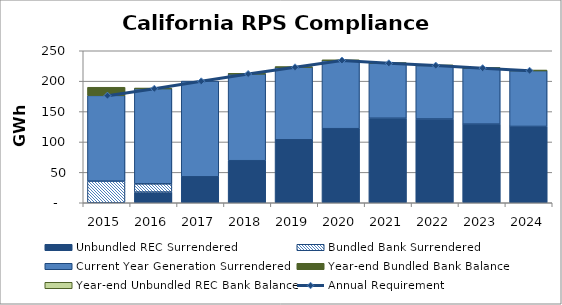
| Category | Unbundled REC Surrendered | Bundled Bank Surrendered | Current Year Generation Surrendered | Compliance Shortfall | Year-end Bundled Bank Balance | Year-end Unbundled REC Bank Balance |
|---|---|---|---|---|---|---|
| 2015.0 | 0 | 35.532 | 141.004 | 0 | 13.471 | 0 |
| 2016.0 | 17.626 | 13.471 | 156.865 | 0 | 0 | 0 |
| 2017.0 | 42.674 | 0 | 157.462 | 0 | 0 | 0 |
| 2018.0 | 69.148 | 0 | 142.978 | 0 | 0 | 0 |
| 2019.0 | 103.55 | 0 | 119.625 | 0 | 0 | 0 |
| 2020.0 | 121.803 | 0 | 112.528 | 0 | 0 | 0 |
| 2021.0 | 138.988 | 0 | 90.741 | 0 | 0 | 0 |
| 2022.0 | 137.722 | 0 | 88.256 | 0 | 0 | 0 |
| 2023.0 | 129.331 | 0 | 92.39 | 0 | 0 | 0 |
| 2024.0 | 125.504 | 0 | 92.032 | 0 | 0 | 0 |